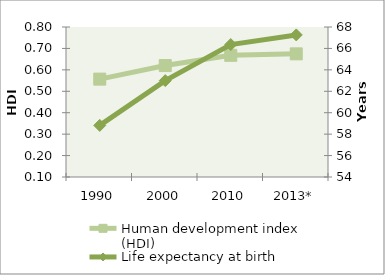
| Category | Human development index (HDI) |
|---|---|
| 1990 | 0.557 |
| 2000 | 0.62 |
| 2010 | 0.668 |
| 2013* | 0.675 |